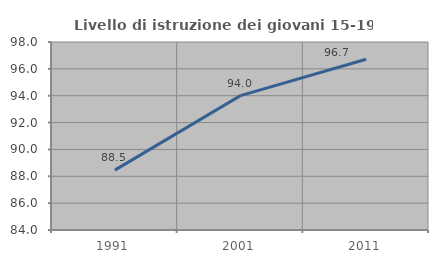
| Category | Livello di istruzione dei giovani 15-19 anni |
|---|---|
| 1991.0 | 88.457 |
| 2001.0 | 94.008 |
| 2011.0 | 96.711 |